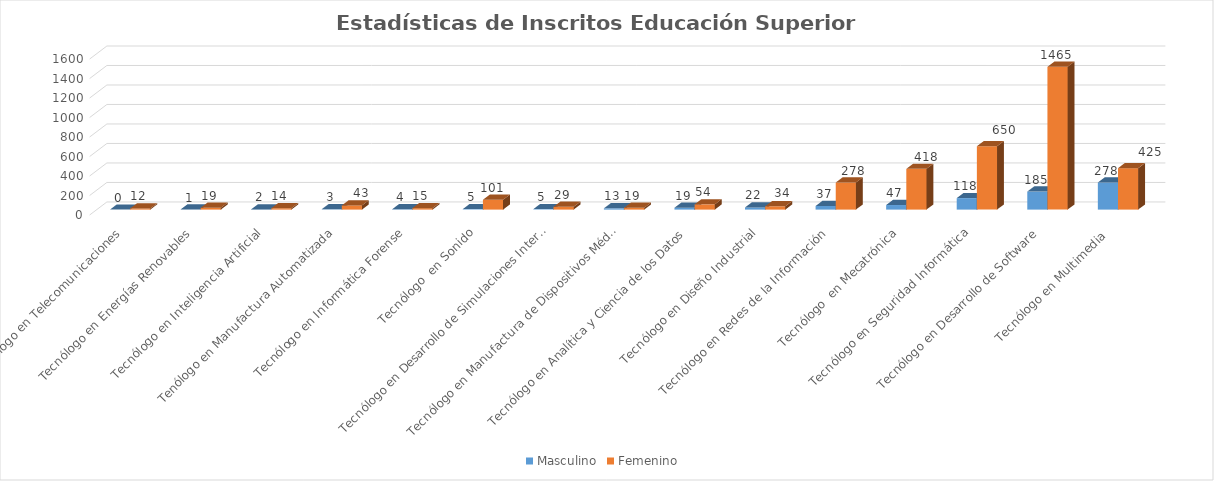
| Category | Masculino | Femenino  |
|---|---|---|
| Tecnólogo en Telecomunicaciones | 0 | 12 |
| Tecnólogo en Energías Renovables | 1 | 19 |
| Tecnólogo en Inteligencia Artificial | 2 | 14 |
| Tenólogo en Manufactura Automatizada | 3 | 43 |
| Tecnólogo en Informática Forense | 4 | 15 |
| Tecnólogo  en Sonido | 5 | 101 |
| Tecnólogo en Desarrollo de Simulaciones Interactivas y Videojuegos | 5 | 29 |
| Tecnólogo en Manufactura de Dispositivos Médicos  | 13 | 19 |
| Tecnólogo en Analítica y Ciencia de los Datos | 19 | 54 |
| Tecnólogo en Diseño Industrial | 22 | 34 |
| Tecnólogo en Redes de la Información | 37 | 278 |
| Tecnólogo  en Mecatrónica | 47 | 418 |
| Tecnólogo en Seguridad Informática | 118 | 650 |
| Tecnólogo en Desarrollo de Software | 185 | 1465 |
| Tecnólogo en Multimedia  | 278 | 425 |